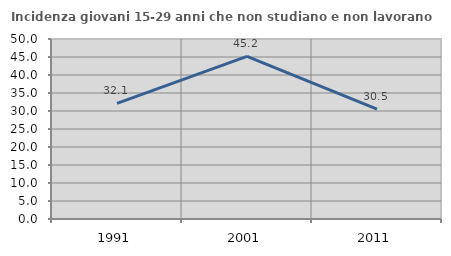
| Category | Incidenza giovani 15-29 anni che non studiano e non lavorano  |
|---|---|
| 1991.0 | 32.143 |
| 2001.0 | 45.194 |
| 2011.0 | 30.518 |